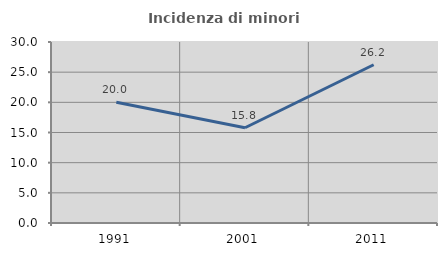
| Category | Incidenza di minori stranieri |
|---|---|
| 1991.0 | 20 |
| 2001.0 | 15.789 |
| 2011.0 | 26.225 |